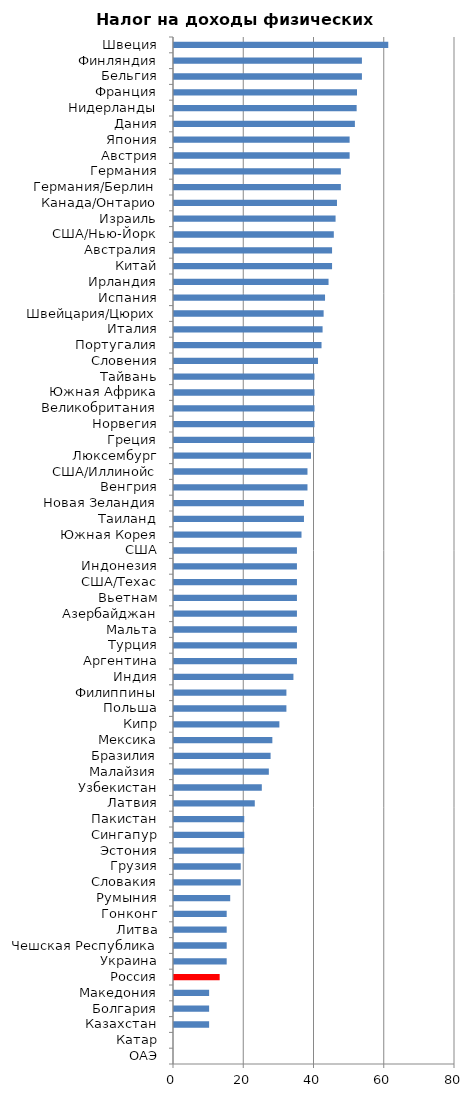
| Category | НДФЛ |
|---|---|
| ОАЭ | 0 |
| Катар | 0 |
| Казахстан | 10 |
| Болгария | 10 |
| Македония | 10 |
| Россия | 13 |
| Украина | 15 |
| Чешская Республика | 15 |
| Литва | 15 |
| Гонконг | 15 |
| Румыния | 16 |
| Словакия | 19 |
| Грузия | 19 |
| Эстония | 20 |
| Сингапур | 20 |
| Пакистан | 20 |
| Латвия | 23 |
| Узбекистан | 25 |
| Малайзия | 27 |
| Бразилия | 27.5 |
| Мексика | 28 |
| Кипр | 30 |
| Польша | 32 |
| Филиппины | 32 |
| Индия | 34 |
| Аргентина | 35 |
| Турция | 35 |
| Мальта | 35 |
| Азербайджан | 35 |
| Вьетнам | 35 |
| США/Техас | 35 |
| Индонезия | 35 |
| США | 35 |
| Южная Корея | 36.3 |
| Таиланд | 37 |
| Новая Зеландия | 37 |
| Венгрия | 38 |
| США/Иллинойс | 38 |
| Люксембург | 39 |
| Греция | 40 |
| Норвегия | 40 |
| Великобритания | 40 |
| Южная Африка | 40 |
| Тайвань | 40 |
| Словения | 41 |
| Португалия | 42 |
| Италия | 42.3 |
| Швейцария/Цюрих | 42.6 |
| Испания | 43 |
| Ирландия | 44 |
| Китай | 45 |
| Австралия | 45 |
| США/Нью-Йорк | 45.5 |
| Израиль | 46 |
| Канада/Онтарио | 46.4 |
| Германия/Берлин | 47.5 |
| Германия | 47.5 |
| Австрия | 50 |
| Япония | 50 |
| Дания | 51.5 |
| Нидерланды | 52 |
| Франция | 52.1 |
| Бельгия | 53.5 |
| Финляндия | 53.5 |
| Швеция | 61 |